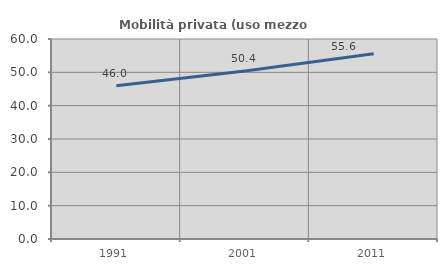
| Category | Mobilità privata (uso mezzo privato) |
|---|---|
| 1991.0 | 45.964 |
| 2001.0 | 50.404 |
| 2011.0 | 55.585 |